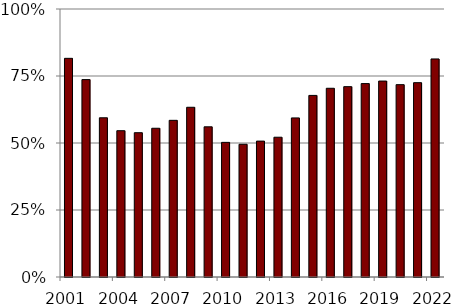
| Category | Series 0 |
|---|---|
| 2001.0 | 0.816 |
| 2002.0 | 0.737 |
| 2003.0 | 0.594 |
| 2004.0 | 0.546 |
| 2005.0 | 0.538 |
| 2006.0 | 0.555 |
| 2007.0 | 0.585 |
| 2008.0 | 0.633 |
| 2009.0 | 0.56 |
| 2010.0 | 0.502 |
| 2011.0 | 0.495 |
| 2012.0 | 0.507 |
| 2013.0 | 0.522 |
| 2014.0 | 0.594 |
| 2015.0 | 0.678 |
| 2016.0 | 0.704 |
| 2017.0 | 0.71 |
| 2018.0 | 0.722 |
| 2019.0 | 0.731 |
| 2020.0 | 0.718 |
| 2021.0 | 0.725 |
| 2022.0 | 0.814 |